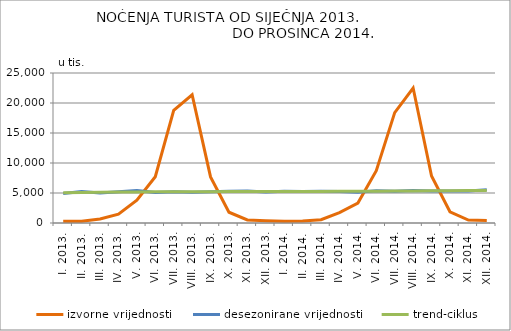
| Category | izvorne vrijednosti | desezonirane vrijednosti | trend-ciklus |
|---|---|---|---|
| I. 2013. | 277 | 4929 | 5061 |
| II. 2013. | 311 | 5231 | 5093 |
| III. 2013. | 681 | 4986 | 5125 |
| IV. 2013. | 1465 | 5223 | 5160 |
| V. 2013. | 3820 | 5433 | 5185 |
| VI. 2013. | 7717 | 5100 | 5192 |
| VII. 2013. | 18792 | 5201 | 5197 |
| VIII. 2013. | 21377 | 5134 | 5207 |
| IX. 2013. | 7683 | 5221 | 5223 |
| X. 2013. | 1799 | 5295 | 5240 |
| XI. 2013. | 508 | 5346 | 5249 |
| XII. 2013. | 387 | 5157 | 5251 |
| I. 2014. | 312 | 5294 | 5256 |
| II. 2014. | 320 | 5246 | 5262 |
| III. 2014. | 556 | 5289 | 5267 |
| IV. 2014. | 1738 | 5262 | 5271 |
| V. 2014. | 3320 | 5119 | 5281 |
| VI. 2014. | 8708 | 5375 | 5302 |
| VII. 2014. | 18402 | 5300 | 5326 |
| VIII. 2014. | 22499 | 5403 | 5346 |
| IX. 2014. | 7840 | 5348 | 5363 |
| X. 2014. | 1876 | 5353 | 5380 |
| XI. 2014. | 488 | 5334 | 5402 |
| XII. 2014. | 425 | 5530 | 5427 |